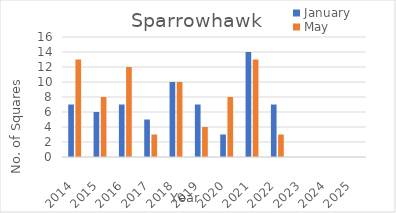
| Category | January | May |
|---|---|---|
| 2014.0 | 7 | 13 |
| 2015.0 | 6 | 8 |
| 2016.0 | 7 | 12 |
| 2017.0 | 5 | 3 |
| 2018.0 | 10 | 10 |
| 2019.0 | 7 | 4 |
| 2020.0 | 3 | 8 |
| 2021.0 | 14 | 13 |
| 2022.0 | 7 | 3 |
| 2023.0 | 0 | 0 |
| 2024.0 | 0 | 0 |
| 2025.0 | 0 | 0 |